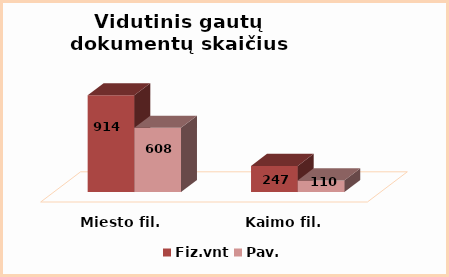
| Category | Fiz.vnt | Pav. |
|---|---|---|
| Miesto fil. | 914 | 608 |
| Kaimo fil. | 247 | 110 |